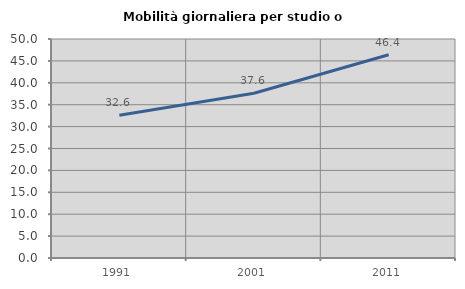
| Category | Mobilità giornaliera per studio o lavoro |
|---|---|
| 1991.0 | 32.604 |
| 2001.0 | 37.624 |
| 2011.0 | 46.403 |